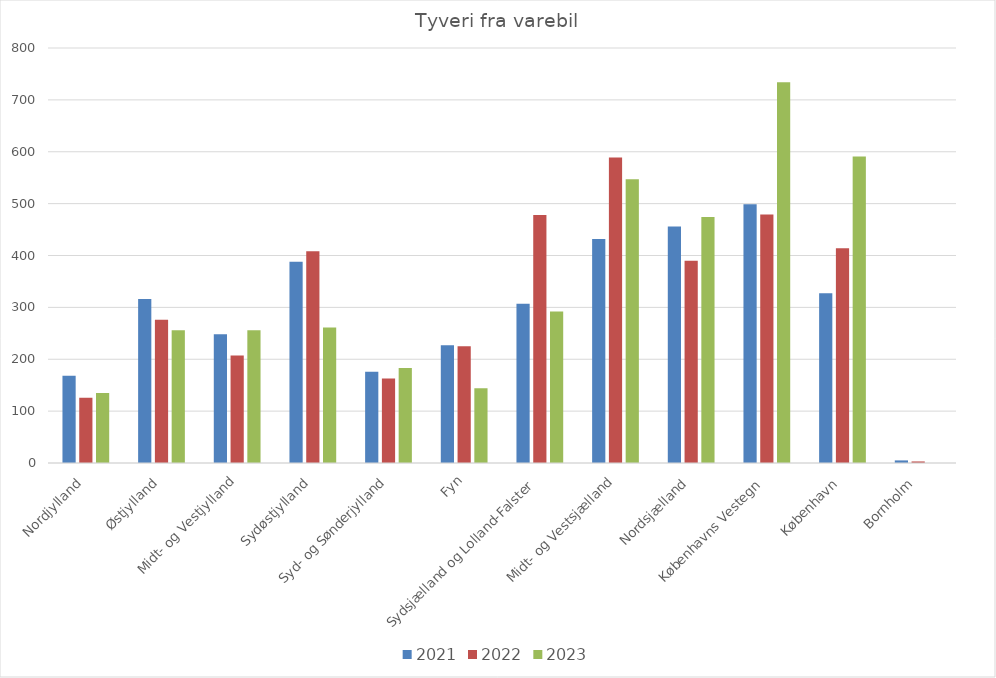
| Category | 2021 | 2022 | 2023 |
|---|---|---|---|
| Nordjylland | 168 | 126 | 135 |
| Østjylland | 316 | 276 | 256 |
| Midt- og Vestjylland | 248 | 207 | 256 |
| Sydøstjylland | 388 | 408 | 261 |
| Syd- og Sønderjylland | 176 | 163 | 183 |
| Fyn | 227 | 225 | 144 |
| Sydsjælland og Lolland-Falster | 307 | 478 | 292 |
| Midt- og Vestsjælland | 432 | 589 | 547 |
| Nordsjælland | 456 | 390 | 474 |
| Københavns Vestegn | 499 | 479 | 734 |
| København | 327 | 414 | 591 |
| Bornholm | 5 | 3 | 0 |